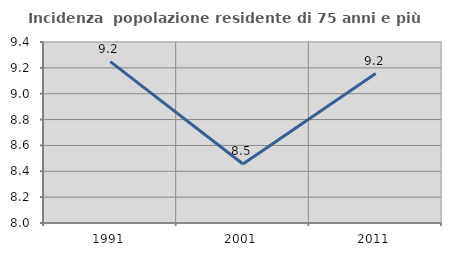
| Category | Incidenza  popolazione residente di 75 anni e più |
|---|---|
| 1991.0 | 9.249 |
| 2001.0 | 8.456 |
| 2011.0 | 9.156 |